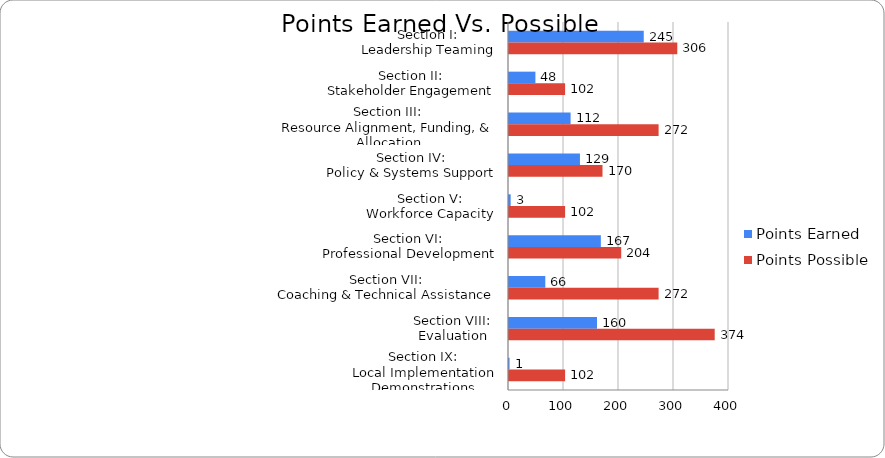
| Category | Points Earned | Points Possible |
|---|---|---|
| Section I:
Leadership Teaming | 245 | 306 |
| Section II:
Stakeholder Engagement | 48 | 102 |
| Section III:
Resource Alignment, Funding, & Allocation | 112 | 272 |
| Section IV:
Policy & Systems Support | 129 | 170 |
| Section V:
Workforce Capacity | 3 | 102 |
| Section VI:
Professional Development | 167 | 204 |
| Section VII:
Coaching & Technical Assistance | 66 | 272 |
| Section VIII:
Evaluation | 160 | 374 |
| Section IX:
Local Implementation Demonstrations | 1 | 102 |